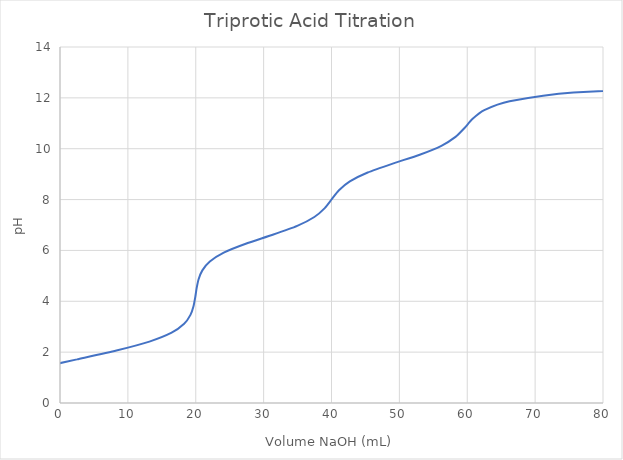
| Category | calc pH |
|---|---|
| -18.163816370309174 | 0 |
| -16.507072442931708 | 0.315 |
| -13.396853086749385 | 0.665 |
| -8.873078003924121 | 1.015 |
| -3.4002561478341824 | 1.365 |
| 2.495778169964122 | 1.715 |
| 8.31004636108624 | 2.065 |
| 13.170498093874324 | 2.415 |
| 16.44539578493563 | 2.765 |
| 18.289034344430007 | 3.115 |
| 19.22116091362 | 3.465 |
| 19.678863018315113 | 3.815 |
| 19.92888906940413 | 4.165 |
| 20.131743918693406 | 4.515 |
| 20.42024558932409 | 4.865 |
| 20.971873422988644 | 5.215 |
| 22.075108055583236 | 5.565 |
| 24.12624819321393 | 5.915 |
| 27.364401161691497 | 6.265 |
| 31.33700510362656 | 6.615 |
| 34.94893092304053 | 6.965 |
| 37.47208523517623 | 7.315 |
| 39.007295364291956 | 7.665 |
| 40.04171105436831 | 8.015 |
| 41.09875539082242 | 8.365 |
| 42.70312824091812 | 8.715 |
| 45.32960564169061 | 9.065 |
| 49.02310174517717 | 9.415 |
| 52.99584947733322 | 9.765 |
| 56.1920745098567 | 10.115 |
| 58.272096243971156 | 10.465 |
| 59.59615406736107 | 10.815 |
| 60.757411274408554 | 11.165 |
| 62.50950671809641 | 11.515 |
| 66.23346622330034 | 11.865 |
| 75.65450354464195 | 12.215 |
| 106.41150227251663 | 12.565 |